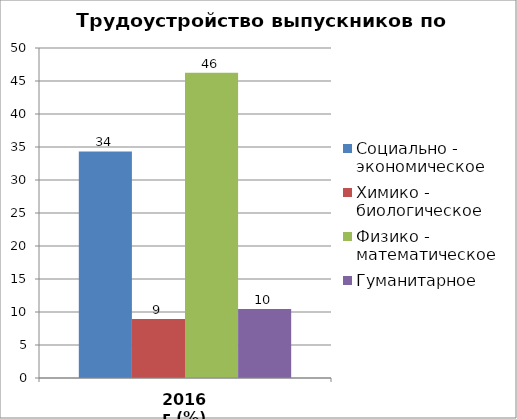
| Category | Социально - экономическое | Химико - биологическое | Физико - математическое | Гуманитарное |
|---|---|---|---|---|
| 2016 г.(%) | 34.328 | 8.955 | 46.269 | 10.448 |